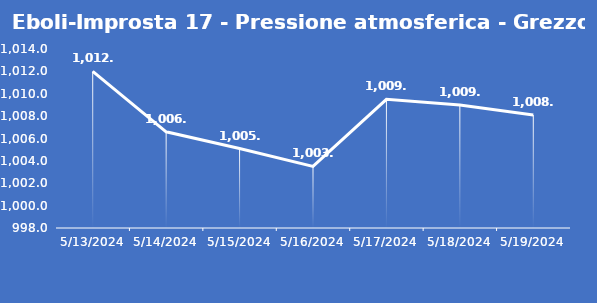
| Category | Eboli-Improsta 17 - Pressione atmosferica - Grezzo (hPa) |
|---|---|
| 5/13/24 | 1012 |
| 5/14/24 | 1006.6 |
| 5/15/24 | 1005.1 |
| 5/16/24 | 1003.5 |
| 5/17/24 | 1009.5 |
| 5/18/24 | 1009 |
| 5/19/24 | 1008.1 |